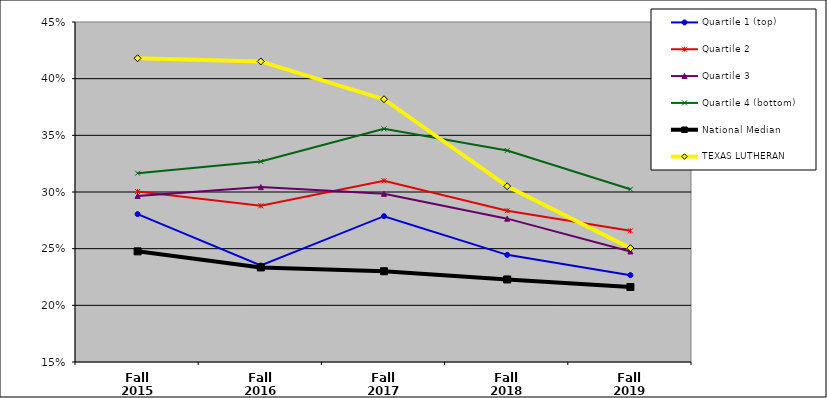
| Category | Quartile 1 (top) | Quartile 2 | Quartile 3 | Quartile 4 (bottom) | National Median | TEXAS LUTHERAN |
|---|---|---|---|---|---|---|
| Fall 2015 | 0.281 | 0.3 | 0.297 | 0.317 | 0.248 | 0.418 |
| Fall 2016 | 0.235 | 0.288 | 0.304 | 0.327 | 0.233 | 0.415 |
| Fall 2017 | 0.279 | 0.31 | 0.298 | 0.356 | 0.23 | 0.382 |
| Fall 2018 | 0.245 | 0.283 | 0.276 | 0.337 | 0.223 | 0.305 |
| Fall 2019 | 0.227 | 0.266 | 0.248 | 0.302 | 0.216 | 0.25 |